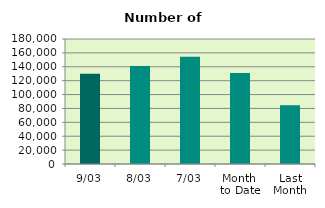
| Category | Series 0 |
|---|---|
| 9/03 | 129878 |
| 8/03 | 141016 |
| 7/03 | 154276 |
| Month 
to Date | 131192.571 |
| Last
Month | 84726.4 |